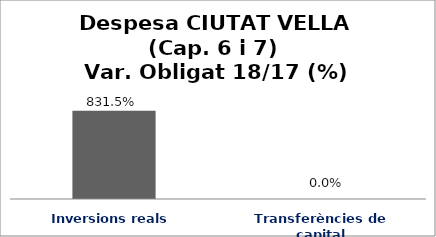
| Category | Series 0 |
|---|---|
| Inversions reals | 8.315 |
| Transferències de capital | 0 |